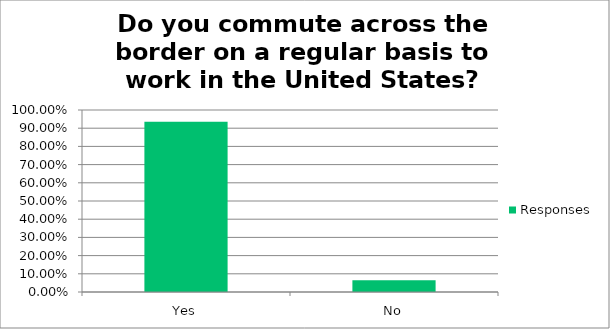
| Category | Responses |
|---|---|
| Yes | 0.936 |
| No | 0.064 |